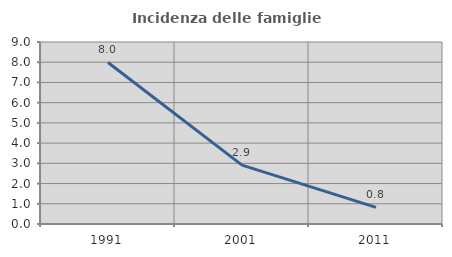
| Category | Incidenza delle famiglie numerose |
|---|---|
| 1991.0 | 7.988 |
| 2001.0 | 2.91 |
| 2011.0 | 0.823 |